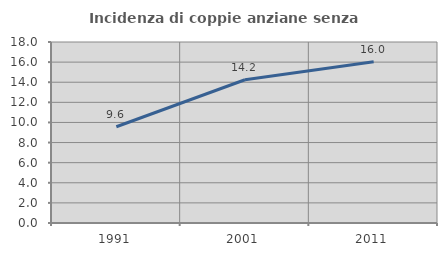
| Category | Incidenza di coppie anziane senza figli  |
|---|---|
| 1991.0 | 9.571 |
| 2001.0 | 14.244 |
| 2011.0 | 16.043 |